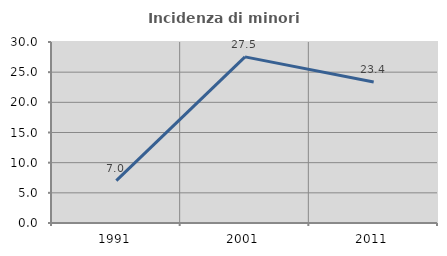
| Category | Incidenza di minori stranieri |
|---|---|
| 1991.0 | 7.018 |
| 2001.0 | 27.536 |
| 2011.0 | 23.367 |